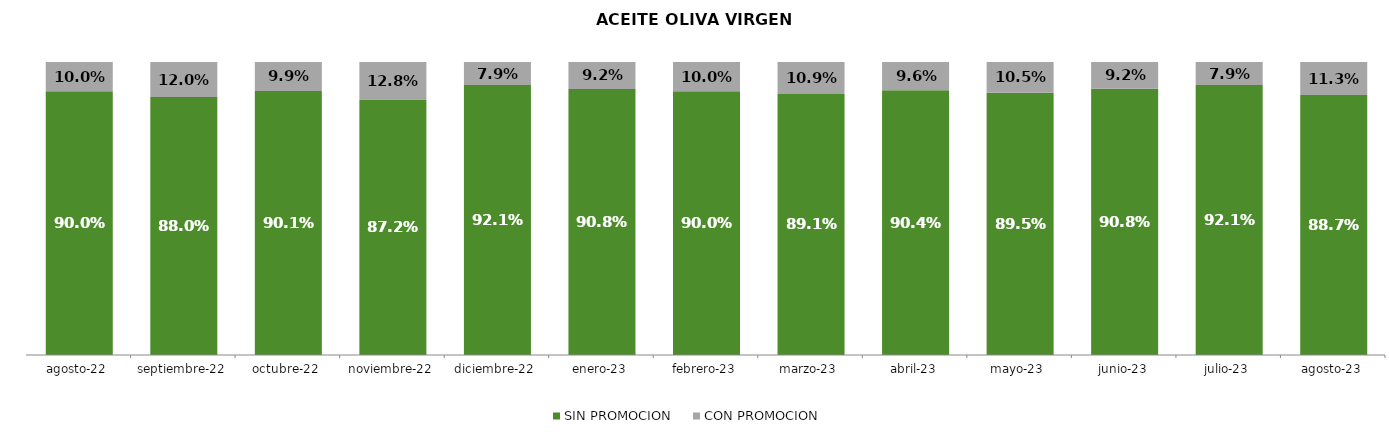
| Category | SIN PROMOCION   | CON PROMOCION   |
|---|---|---|
| 2022-08-01 | 0.9 | 0.1 |
| 2022-09-01 | 0.88 | 0.12 |
| 2022-10-01 | 0.901 | 0.099 |
| 2022-11-01 | 0.872 | 0.128 |
| 2022-12-01 | 0.921 | 0.079 |
| 2023-01-01 | 0.908 | 0.092 |
| 2023-02-01 | 0.9 | 0.1 |
| 2023-03-01 | 0.891 | 0.109 |
| 2023-04-01 | 0.904 | 0.096 |
| 2023-05-01 | 0.895 | 0.105 |
| 2023-06-01 | 0.908 | 0.092 |
| 2023-07-01 | 0.921 | 0.079 |
| 2023-08-01 | 0.887 | 0.113 |